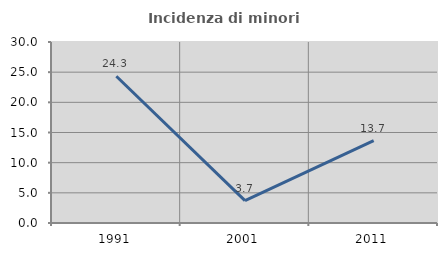
| Category | Incidenza di minori stranieri |
|---|---|
| 1991.0 | 24.324 |
| 2001.0 | 3.704 |
| 2011.0 | 13.659 |